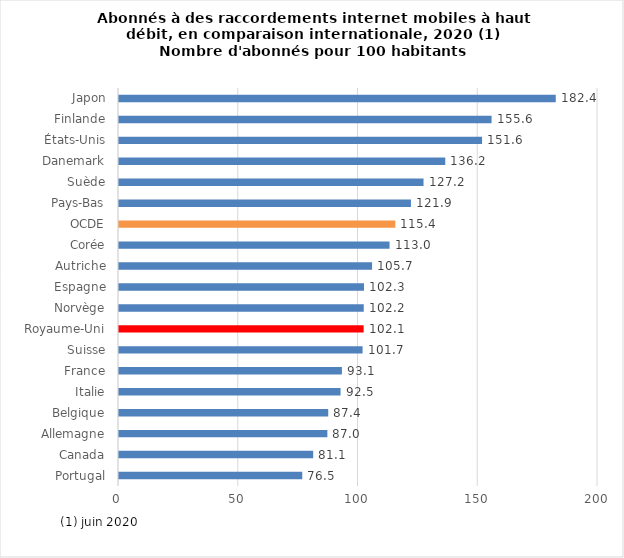
| Category | Series 0 |
|---|---|
| Portugal | 76.51 |
| Canada | 81.09 |
| Allemagne | 87 |
| Belgique | 87.36 |
| Italie | 92.51 |
| France | 93.07 |
| Suisse | 101.7 |
| Royaume-Uni | 102.14 |
| Norvège | 102.19 |
| Espagne | 102.29 |
| Autriche | 105.66 |
| Corée | 112.96 |
| OCDE | 115.37 |
| Pays-Bas | 121.9 |
| Suède | 127.15 |
| Danemark | 136.23 |
| États-Unis | 151.59 |
| Finlande | 155.57 |
| Japon | 182.36 |